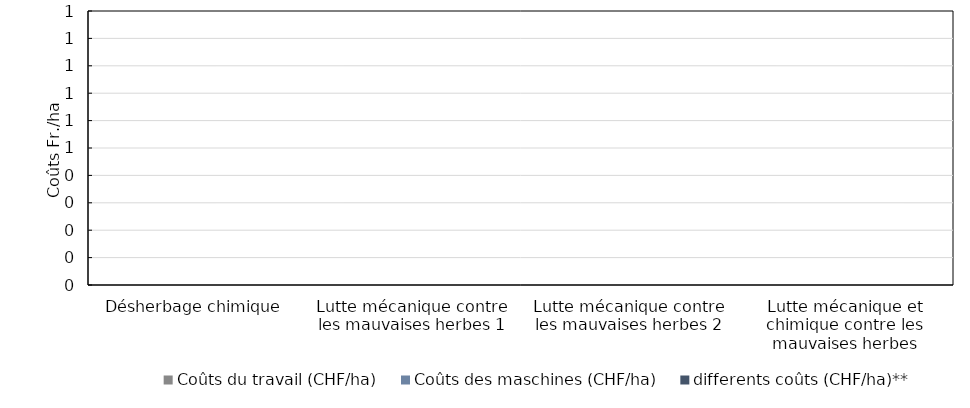
| Category | Coûts du travail (CHF/ha) | Coûts des maschines (CHF/ha) | differents coûts (CHF/ha)** |
|---|---|---|---|
| Désherbage chimique | 0 | 0 | 0 |
| Lutte mécanique contre les mauvaises herbes 1 | 0 | 0 | 0 |
| Lutte mécanique contre les mauvaises herbes 2 | 0 | 0 | 0 |
| Lutte mécanique et chimique contre les mauvaises herbes | 0 | 0 | 0 |